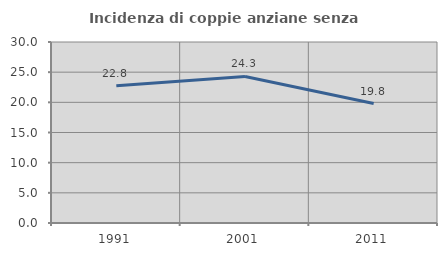
| Category | Incidenza di coppie anziane senza figli  |
|---|---|
| 1991.0 | 22.76 |
| 2001.0 | 24.286 |
| 2011.0 | 19.806 |